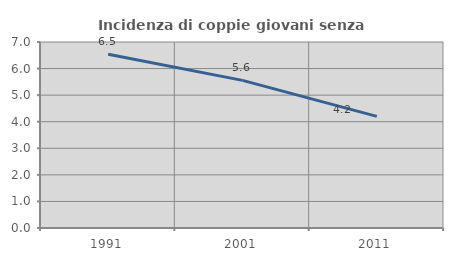
| Category | Incidenza di coppie giovani senza figli |
|---|---|
| 1991.0 | 6.542 |
| 2001.0 | 5.556 |
| 2011.0 | 4.199 |